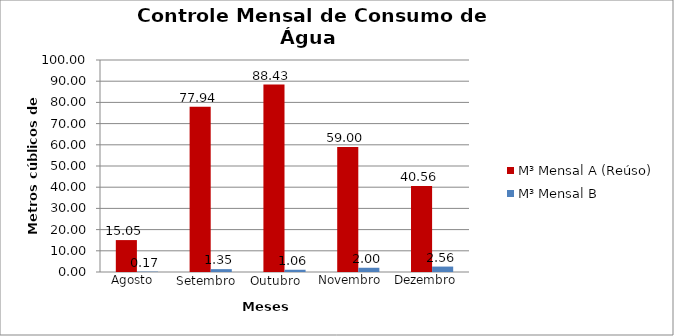
| Category | M³ Mensal A (Reúso) | M³ Mensal B |
|---|---|---|
| 0 | 15.05 | 0.17 |
| 1 | 77.94 | 1.35 |
| 2 | 88.43 | 1.06 |
| 3 | 59 | 2 |
| 4 | 40.56 | 2.56 |